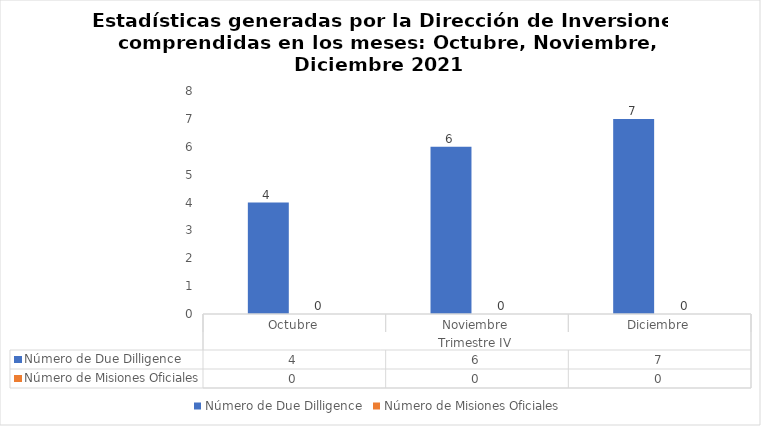
| Category | Número de Due Dilligence | Número de Misiones Oficiales |
|---|---|---|
| 0 | 4 | 0 |
| 1 | 6 | 0 |
| 2 | 7 | 0 |